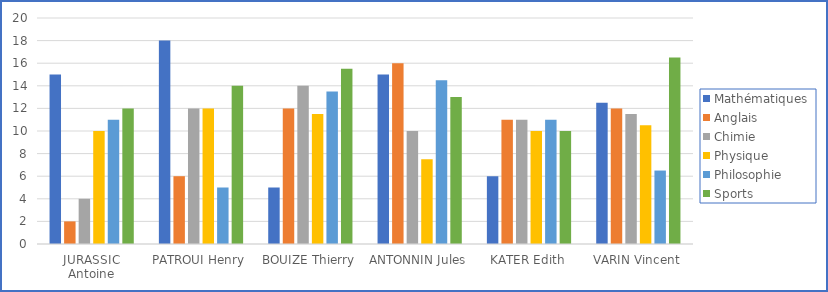
| Category | Mathématiques | Anglais | Chimie | Physique | Philosophie | Sports |
|---|---|---|---|---|---|---|
| JURASSIC Antoine | 15 | 2 | 4 | 10 | 11 | 12 |
| PATROUI Henry | 18 | 6 | 12 | 12 | 5 | 14 |
| BOUIZE Thierry | 5 | 12 | 14 | 11.5 | 13.5 | 15.5 |
| ANTONNIN Jules | 15 | 16 | 10 | 7.5 | 14.5 | 13 |
| KATER Edith | 6 | 11 | 11 | 10 | 11 | 10 |
| VARIN Vincent | 12.5 | 12 | 11.5 | 10.5 | 6.5 | 16.5 |